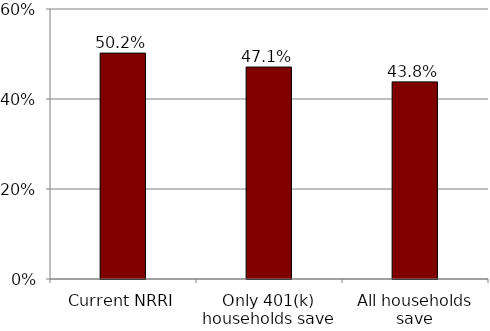
| Category | Series 0 |
|---|---|
| Current NRRI | 0.502 |
| Only 401(k) households save | 0.471 |
| All households save | 0.438 |